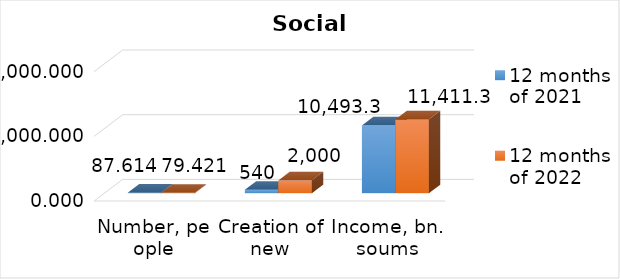
| Category | 12 months of 2021 | 12 months of 2022 |
|---|---|---|
| Number, people | 87.614 | 79.421 |
| Creation of new workplaces | 540 | 2000 |
| Income, bn. soums | 10493.3 | 11411.3 |